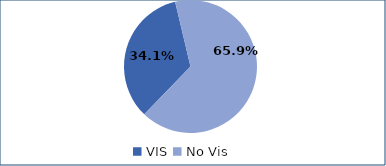
| Category | Series 0 |
|---|---|
| VIS | 0.341 |
| No Vis | 0.659 |